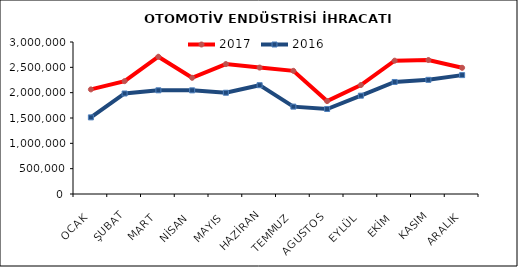
| Category | 2017 | 2016 |
|---|---|---|
| OCAK | 2064186.633 | 1512280.437 |
| ŞUBAT | 2227175.836 | 1983742.384 |
| MART | 2708888.199 | 2046625.306 |
| NİSAN | 2293564.015 | 2045816.25 |
| MAYIS | 2564301.814 | 1998418.099 |
| HAZİRAN | 2495096.222 | 2147765.072 |
| TEMMUZ | 2431113.116 | 1724587.262 |
| AGUSTOS | 1833736.009 | 1677699.574 |
| EYLÜL | 2149862.446 | 1940445.813 |
| EKİM | 2631196.392 | 2210886.454 |
| KASIM | 2644591.589 | 2253215.299 |
| ARALIK | 2490844.058 | 2346446.898 |